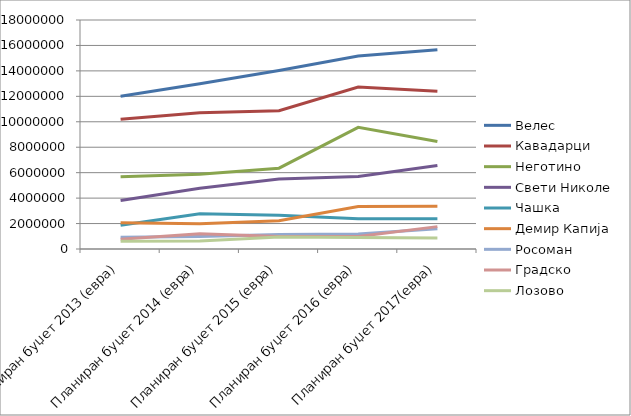
| Category | Велес | Кавадарци | Неготино  | Свети Николе | Чашка | Демир Капија | Росоман | Градско | Лозово |
|---|---|---|---|---|---|---|---|---|---|
| Планиран буџет 2013 (евра) | 12007561.496 | 10196227.642 | 5673826.553 | 3809062.423 | 1860834.39 | 2071851.691 | 932903.675 | 762386.472 | 609670.65 |
| Планиран буџет 2014 (евра) | 12981015.821 | 10711869.919 | 5881479.675 | 4778911.724 | 2768817.431 | 1989645.203 | 974966.813 | 1195007.187 | 633452.016 |
| Планиран буџет 2015 (евра) | 14029896.569 | 10870325.203 | 6352536.585 | 5494054.504 | 2662153.252 | 2213499.463 | 1133676.13 | 985364.39 | 943652.244 |
| Планиран буџет 2016 (евра) | 15164072.911 | 12724975.61 | 9561707.317 | 5706828.634 | 2374421.61 | 3338474.163 | 1171029.61 | 980676.439 | 899156.146 |
| Планиран буџет 2017(евра) | 15663312.927 | 12400585.366 | 8454552.846 | 6568155.528 | 2386235.805 | 3353879.984 | 1587292.683 | 1758243.902 | 871304.163 |